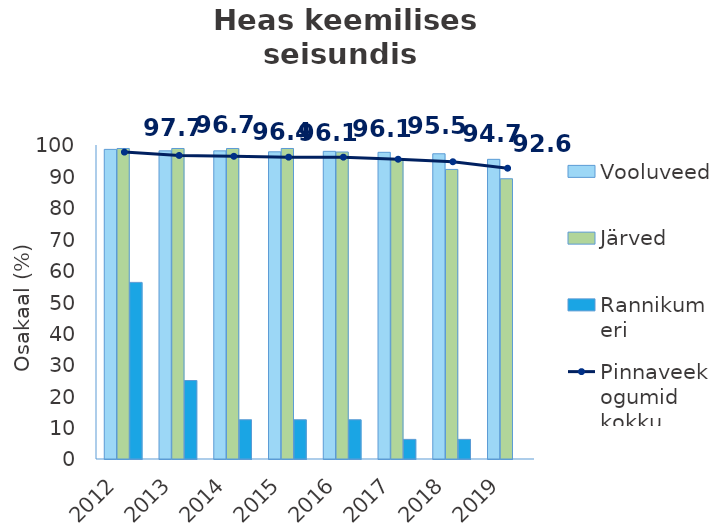
| Category | Vooluveed | Järved | Rannikumeri |
|---|---|---|---|
| 2012.0 | 98.602 | 98.889 | 56.25 |
| 2013.0 | 98.137 | 98.889 | 25 |
| 2014.0 | 98.137 | 98.889 | 12.5 |
| 2015.0 | 97.826 | 98.889 | 12.5 |
| 2016.0 | 97.981 | 97.778 | 12.5 |
| 2017.0 | 97.671 | 95.556 | 6.25 |
| 2018.0 | 97.205 | 92.222 | 6.25 |
| 2019.0 | 95.433 | 89.247 | 0 |